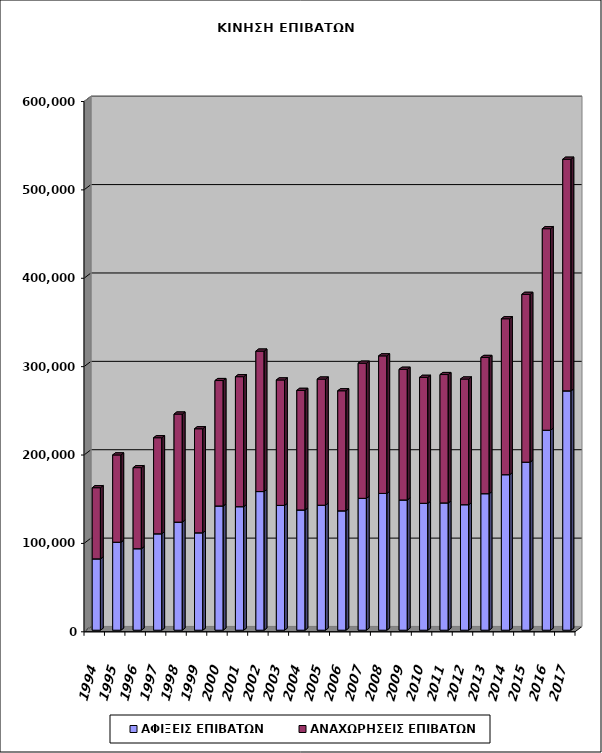
| Category | ΑΦΙΞΕΙΣ ΕΠΙΒΑΤΩΝ | ΑΝΑΧΩΡΗΣΕΙΣ ΕΠΙΒΑΤΩΝ |
|---|---|---|
| 1994.0 | 80734 | 80495 |
| 1995.0 | 99550 | 98750 |
| 1996.0 | 92225 | 91708 |
| 1997.0 | 109088 | 108686 |
| 1998.0 | 122303 | 122258 |
| 1999.0 | 110199 | 117733 |
| 2000.0 | 140592 | 141890 |
| 2001.0 | 139773 | 147084 |
| 2002.0 | 156879 | 158912 |
| 2003.0 | 141254 | 141908 |
| 2004.0 | 136061 | 135301 |
| 2005.0 | 141440 | 142712 |
| 2006.0 | 135083 | 135818 |
| 2007.0 | 149231 | 152857 |
| 2008.0 | 154765 | 155639 |
| 2009.0 | 147402 | 147831 |
| 2010.0 | 143597 | 142508 |
| 2011.0 | 144058 | 145207 |
| 2012.0 | 142027 | 142179 |
| 2013.0 | 154489 | 154118 |
| 2014.0 | 175986 | 176398 |
| 2015.0 | 190129 | 189882 |
| 2016.0 | 226308 | 227992 |
| 2017.0 | 270825 | 262054 |